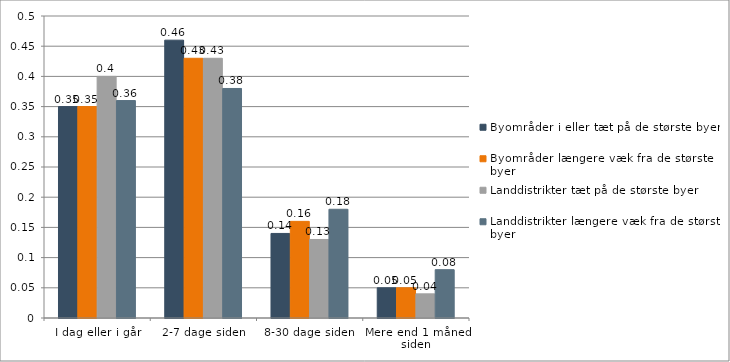
| Category | Byområder i eller tæt på de største byer | Byområder længere væk fra de største byer | Landdistrikter tæt på de største byer | Landdistrikter længere væk fra de største byer |
|---|---|---|---|---|
| I dag eller i går | 0.35 | 0.35 | 0.4 | 0.36 |
| 2-7 dage siden | 0.46 | 0.43 | 0.43 | 0.38 |
| 8-30 dage siden | 0.14 | 0.16 | 0.13 | 0.18 |
| Mere end 1 måned siden | 0.05 | 0.05 | 0.04 | 0.08 |